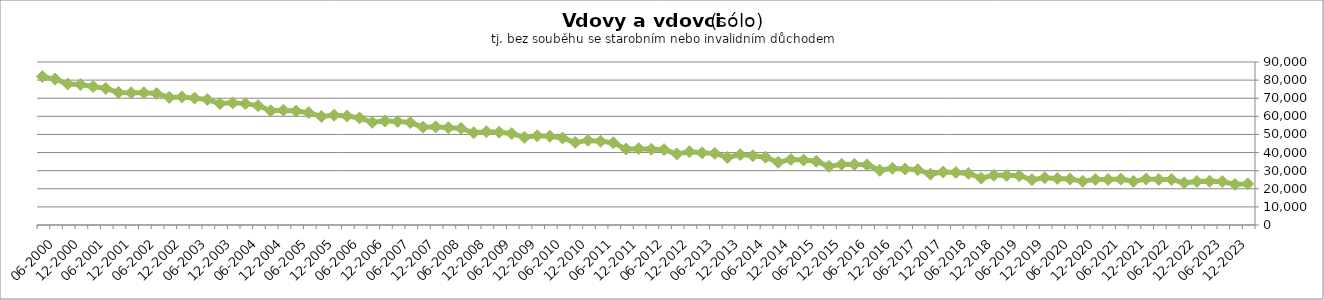
| Category | Series 0 |
|---|---|
| 12-2023 | 22708 |
| 09-2023 | 22397 |
| 06-2023 | 24032 |
| 03-2023 | 24183 |
| 12-2022 | 24031 |
| 09-2022 | 23271 |
| 06-2022 | 25158 |
| 03-2022 | 25108 |
| 12-2021 | 25413 |
| 09-2021 | 24076 |
| 06-2021 | 25368 |
| 03-2021 | 25104 |
| 12-2020 | 25179 |
| 09-2020 | 24123 |
| 06-2020 | 25403 |
| 03-2020 | 25682 |
| 12-2019 | 26103 |
| 09-2019 | 25007 |
| 06-2019 | 27197 |
| 03-2019 | 27407 |
| 12-2018 | 27439 |
| 09-2018 | 25855 |
| 06-2018 | 28480 |
| 03-2018 | 29027 |
| 12-2017 | 29266 |
| 09-2017 | 28066 |
| 06-2017 | 30540 |
| 03-2017 | 30901 |
| 12-2016 | 31304 |
| 09-2016 | 30205 |
| 06-2016 | 33214 |
| 03-2016 | 33452 |
| 12-2015 | 33545 |
| 09-2015 | 32379 |
| 06-2015 | 35202 |
| 03-2015 | 35871 |
| 12-2014 | 36205 |
| 09-2014 | 34615 |
| 06-2014 | 37458 |
| 03-2014 | 38241 |
| 12-2013 | 38863 |
| 09-2013 | 37308 |
| 06-2013 | 39543 |
| 03-2013 | 39855 |
| 12-2012 | 40471 |
| 09-2012 | 39222 |
| 06-2012 | 41642 |
| 03-2012 | 41843 |
| 12-2011 | 42131 |
| 09-2011 | 41957 |
| 06-2011 | 45409 |
| 03-2011 | 46228 |
| 12-2010 | 46711 |
| 09-2010 | 45576 |
| 06-2010 | 48049 |
| 03-2010 | 48999 |
| 12-2009 | 49281 |
| 09-2009 | 48426 |
| 06-2009 | 50475 |
| 03-2009 | 51222 |
| 12-2008 | 51507 |
| 09-2008 | 50932 |
| 06-2008 | 53339 |
| 03-2008 | 53762 |
| 12-2007 | 54195 |
| 09-2007 | 54031 |
| 06-2007 | 56555 |
| 03-2007 | 57198 |
| 12-2006 | 57411 |
| 09-2006 | 56708 |
| 06-2006 | 59147 |
| 03-2006 | 60177 |
| 12-2005 | 60632 |
| 09-2005 | 59906 |
| 06-2005 | 62019 |
| 03-2005 | 62924 |
| 12-2004 | 63374 |
| 09-2004 | 63082 |
| 06-2004 | 65903 |
| 03-2004 | 67021 |
| 12-2003 | 67438 |
| 09-2003 | 67057 |
| 06-2003 | 69261 |
| 03-2003 | 70062 |
| 12-2002 | 70729 |
| 09-2002 | 70459 |
| 06-2002 | 72581 |
| 03-2002 | 73062 |
| 12-2001 | 72998 |
| 09-2001 | 73205 |
| 06-2001 | 75394 |
| 03-2001 | 76494 |
| 12-2000 | 77545 |
| 09-2000 | 77874 |
| 06-2000 | 80586 |
| 03-2000 | 81947 |